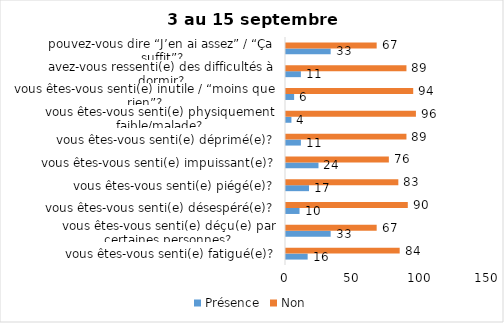
| Category | Présence | Non |
|---|---|---|
| vous êtes-vous senti(e) fatigué(e)? | 16 | 84 |
| vous êtes-vous senti(e) déçu(e) par certaines personnes? | 33 | 67 |
| vous êtes-vous senti(e) désespéré(e)? | 10 | 90 |
| vous êtes-vous senti(e) piégé(e)? | 17 | 83 |
| vous êtes-vous senti(e) impuissant(e)? | 24 | 76 |
| vous êtes-vous senti(e) déprimé(e)? | 11 | 89 |
| vous êtes-vous senti(e) physiquement faible/malade? | 4 | 96 |
| vous êtes-vous senti(e) inutile / “moins que rien”? | 6 | 94 |
| avez-vous ressenti(e) des difficultés à dormir? | 11 | 89 |
| pouvez-vous dire “J’en ai assez” / “Ça suffit”? | 33 | 67 |